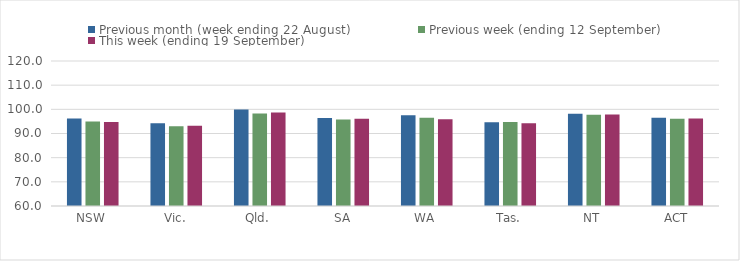
| Category | Previous month (week ending 22 August) | Previous week (ending 12 September) | This week (ending 19 September) |
|---|---|---|---|
| NSW | 96.24 | 94.95 | 94.72 |
| Vic. | 94.26 | 93.01 | 93.22 |
| Qld. | 99.94 | 98.24 | 98.73 |
| SA | 96.46 | 95.8 | 96.07 |
| WA | 97.52 | 96.5 | 95.9 |
| Tas. | 94.66 | 94.74 | 94.29 |
| NT | 98.17 | 97.76 | 97.91 |
| ACT | 96.51 | 96.11 | 96.16 |